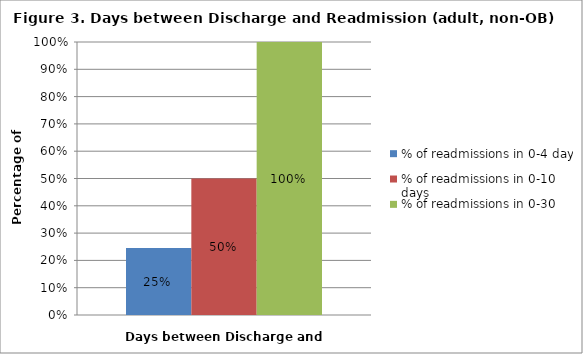
| Category | % of readmissions in 0-4 days | % of readmissions in 0-10 days | % of readmissions in 0-30 days |
|---|---|---|---|
| All | 0.245 | 0.5 | 1 |